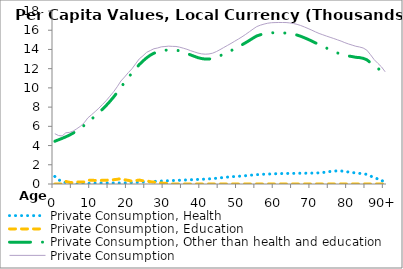
| Category | Private Consumption, Health | Private Consumption, Education | Private Consumption, Other than health and education | Private Consumption |
|---|---|---|---|---|
| 0 | 785.409 | 0 | 4449.2 | 5234.609 |
|  | 445.971 | 0 | 4597.198 | 5043.17 |
| 2 | 253.232 | 0 | 4750.379 | 5003.611 |
| 3 | 151.735 | 269.394 | 4909.702 | 5330.831 |
| 4 | 104.876 | 172.186 | 5091.767 | 5368.829 |
| 5 | 78.729 | 129.108 | 5301.173 | 5509.01 |
| 6 | 0 | 210.16 | 5540.4 | 5750.56 |
| 7 | 0 | 209.298 | 5808.043 | 6017.341 |
| 8 | 56.297 | 210.16 | 6105.265 | 6371.722 |
| 9 | 60.904 | 399.549 | 6420.642 | 6881.095 |
| 10 | 67.011 | 390.638 | 6746.63 | 7204.278 |
| 11 | 84.988 | 370.259 | 7084.355 | 7539.603 |
| 12 | 104.95 | 357.169 | 7429.682 | 7891.801 |
| 13 | 114.168 | 387.226 | 7784.173 | 8285.567 |
| 14 | 115.081 | 391.609 | 8170.945 | 8677.635 |
| 15 | 109.987 | 433.052 | 8588.884 | 9131.922 |
| 16 | 100.823 | 443.4 | 9041.655 | 9585.879 |
| 17 | 97.968 | 490.358 | 9531.259 | 10119.585 |
| 18 | 106.092 | 557.636 | 10052.347 | 10716.076 |
| 19 | 117.03 | 441.763 | 10572.375 | 11131.167 |
| 20 | 131.166 | 380.604 | 11072.14 | 11583.91 |
| 21 | 151.001 | 295.575 | 11533.903 | 11980.479 |
| 22 | 168.994 | 356.585 | 11977.505 | 12503.084 |
| 23 | 186.615 | 409.286 | 12421.952 | 13017.854 |
| 24 | 205.776 | 335.224 | 12794.132 | 13335.132 |
| 25 | 227.681 | 346.179 | 13122.416 | 13696.276 |
| 26 | 248.348 | 233.068 | 13401.764 | 13883.18 |
| 27 | 269.11 | 196.992 | 13607.011 | 14073.112 |
| 28 | 287.116 | 130.258 | 13733.398 | 14150.773 |
| 29 | 305.702 | 108.499 | 13854.954 | 14269.155 |
| 30 | 322.956 | 65.881 | 13915.694 | 14304.531 |
| 31 | 340.78 | 61.113 | 13943.358 | 14345.251 |
| 32 | 358.042 | 0 | 13962.414 | 14320.456 |
| 33 | 373.413 | 0 | 13937.541 | 14310.954 |
| 34 | 389.978 | 0 | 13846.628 | 14236.606 |
| 35 | 408.422 | 0 | 13723.242 | 14131.663 |
| 36 | 425.853 | 0 | 13590.186 | 14016.039 |
| 37 | 442.41 | 0 | 13429.565 | 13871.975 |
| 38 | 461.557 | 0 | 13285.188 | 13746.745 |
| 39 | 478.164 | 0 | 13144.217 | 13622.381 |
| 40 | 489.95 | 0 | 13050.053 | 13540.003 |
| 41 | 507.569 | 0 | 12997.866 | 13505.434 |
| 42 | 531.823 | 0 | 13000.088 | 13531.911 |
| 43 | 559.413 | 0 | 13053.645 | 13613.058 |
| 44 | 593.428 | 0 | 13182.709 | 13776.137 |
| 45 | 637.582 | 0 | 13337.61 | 13975.193 |
| 46 | 681.574 | 0 | 13514.782 | 14196.356 |
| 47 | 717.389 | 0 | 13692.033 | 14409.422 |
| 48 | 748.544 | 0 | 13876.602 | 14625.146 |
| 49 | 778.141 | 0 | 14075.182 | 14853.323 |
| 50 | 802.734 | 0 | 14276.819 | 15079.553 |
| 51 | 830.71 | 0 | 14485.099 | 15315.809 |
| 52 | 865.516 | 0 | 14705.586 | 15571.102 |
| 53 | 904.173 | 0 | 14937.516 | 15841.689 |
| 54 | 938.136 | 0 | 15178.501 | 16116.637 |
| 55 | 970.902 | 0 | 15404.212 | 16375.114 |
| 56 | 994.674 | 0 | 15529.632 | 16524.306 |
| 57 | 1015.444 | 0 | 15621.462 | 16636.906 |
| 58 | 1031.27 | 0 | 15697.767 | 16729.037 |
| 59 | 1049.056 | 0 | 15730.656 | 16779.712 |
| 60 | 1065.155 | 0 | 15730.417 | 16795.572 |
| 61 | 1077.553 | 0 | 15726.235 | 16803.788 |
| 62 | 1085.838 | 0 | 15716.776 | 16802.613 |
| 63 | 1095.296 | 0 | 15703.792 | 16799.088 |
| 64 | 1101.504 | 0 | 15658.527 | 16760.031 |
| 65 | 1104.728 | 0 | 15594.177 | 16698.905 |
| 66 | 1112.326 | 0 | 15497.156 | 16609.482 |
| 67 | 1121.369 | 0 | 15367.229 | 16488.598 |
| 68 | 1124.014 | 0 | 15214.983 | 16338.998 |
| 69 | 1125.445 | 0 | 15050.901 | 16176.346 |
| 70 | 1131.954 | 0 | 14875.552 | 16007.506 |
| 71 | 1142.253 | 0 | 14685.998 | 15828.251 |
| 72 | 1157.441 | 0 | 14505.949 | 15663.39 |
| 73 | 1193.088 | 0 | 14335.501 | 15528.589 |
| 74 | 1245.1 | 0 | 14146.611 | 15391.71 |
| 75 | 1300.75 | 0 | 13961.624 | 15262.374 |
| 76 | 1344.812 | 0 | 13792.145 | 15136.957 |
| 77 | 1367.954 | 0 | 13634.762 | 15002.716 |
| 78 | 1354.434 | 0 | 13511.979 | 14866.413 |
| 79 | 1302.504 | 0 | 13406.583 | 14709.087 |
| 80 | 1250.272 | 0 | 13320.191 | 14570.463 |
| 81 | 1194.185 | 0 | 13257.35 | 14451.535 |
| 82 | 1149.784 | 0 | 13181.543 | 14331.328 |
| 83 | 1106.957 | 0 | 13149.704 | 14256.661 |
| 84 | 1073.285 | 0 | 13078.567 | 14151.852 |
| 85 | 1002.232 | 0 | 12926.655 | 13928.887 |
| 86 | 831.341 | 0 | 12625.83 | 13457.17 |
| 87 | 660.298 | 0 | 12283.618 | 12943.917 |
| 88 | 528.167 | 0 | 12028.968 | 12557.135 |
| 89 | 422.476 | 0 | 11765.222 | 12187.698 |
| 90+ | 0 | 0 | 11673.101 | 11673.101 |